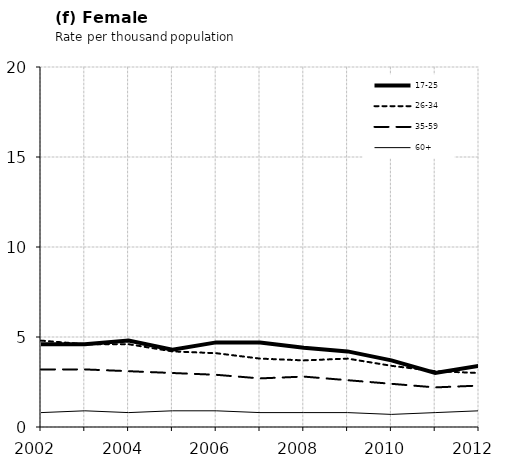
| Category | 17-25 | 26-34 | 35-59 | 60+ |
|---|---|---|---|---|
| 2002.0 | 4.6 | 4.8 | 3.2 | 0.8 |
| 2003.0 | 4.6 | 4.6 | 3.2 | 0.9 |
| 2004.0 | 4.8 | 4.6 | 3.1 | 0.8 |
| 2005.0 | 4.3 | 4.2 | 3 | 0.9 |
| 2006.0 | 4.7 | 4.1 | 2.9 | 0.9 |
| 2007.0 | 4.7 | 3.8 | 2.7 | 0.8 |
| 2008.0 | 4.4 | 3.7 | 2.8 | 0.8 |
| 2009.0 | 4.2 | 3.8 | 2.6 | 0.8 |
| 2010.0 | 3.7 | 3.4 | 2.4 | 0.7 |
| 2011.0 | 3 | 3.1 | 2.2 | 0.8 |
| 2012.0 | 3.4 | 3 | 2.3 | 0.9 |